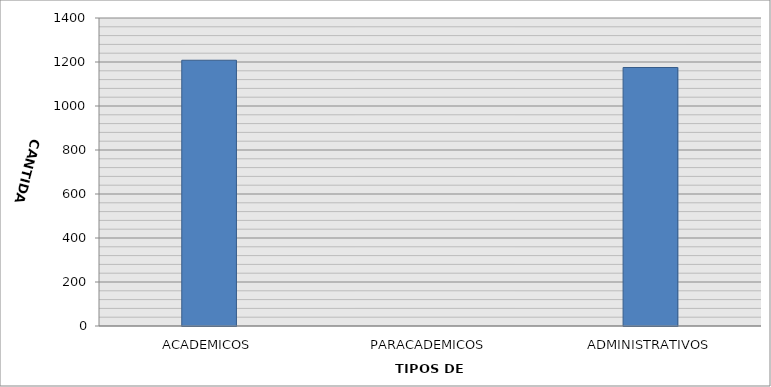
| Category | CANTIDAD |
|---|---|
| ACADEMICOS | 1208 |
| PARACADEMICOS | 0 |
| ADMINISTRATIVOS | 1175 |